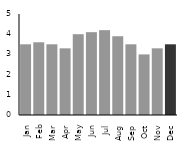
| Category | Feedback_x000d_Cards |
|---|---|
| Jan | 3.5 |
| Feb | 3.6 |
| Mar | 3.5 |
| Apr | 3.3 |
| May | 4 |
| Jun | 4.1 |
| Jul | 4.2 |
| Aug | 3.9 |
| Sep | 3.5 |
| Oct | 3 |
| Nov | 3.3 |
| Dec | 3.5 |